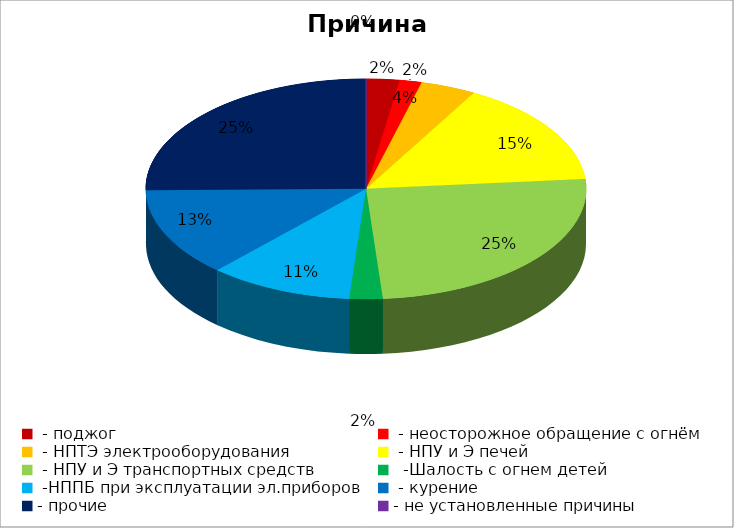
| Category | Причина пожара |
|---|---|
|  - поджог | 3 |
|  - неосторожное обращение с огнём | 2 |
|  - НПТЭ электрооборудования | 5 |
|  - НПУ и Э печей | 19 |
|  - НПУ и Э транспортных средств | 31 |
|   -Шалость с огнем детей | 3 |
|  -НППБ при эксплуатации эл.приборов | 13 |
|  - курение | 16 |
| - прочие | 31 |
| - не установленные причины | 0 |